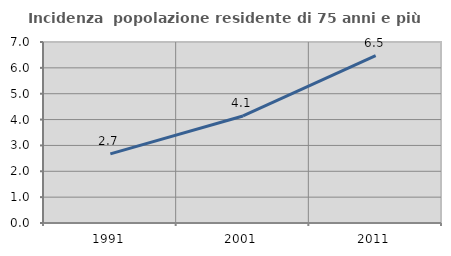
| Category | Incidenza  popolazione residente di 75 anni e più |
|---|---|
| 1991.0 | 2.675 |
| 2001.0 | 4.14 |
| 2011.0 | 6.475 |